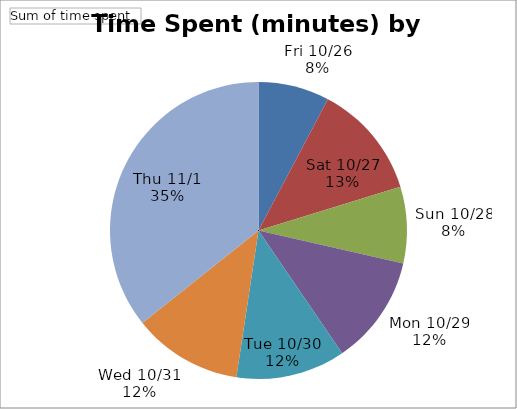
| Category | Total |
|---|---|
| Fri 10/26 | 13 |
| Sat 10/27 | 21 |
| Sun 10/28 | 14 |
| Mon 10/29 | 20 |
| Tue 10/30 | 20 |
| Wed 10/31 | 20 |
| Thu 11/1 | 60 |